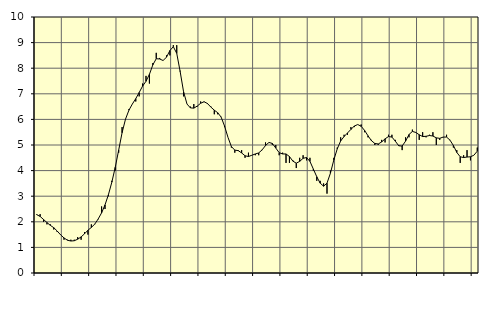
| Category | Piggar | Series 1 |
|---|---|---|
| nan | 2.3 | 2.28 |
| 87.0 | 2.3 | 2.21 |
| 87.0 | 2 | 2.09 |
| 87.0 | 1.9 | 1.97 |
| nan | 1.9 | 1.86 |
| 88.0 | 1.7 | 1.77 |
| 88.0 | 1.6 | 1.64 |
| 88.0 | 1.5 | 1.49 |
| nan | 1.3 | 1.37 |
| 89.0 | 1.3 | 1.28 |
| 89.0 | 1.3 | 1.25 |
| 89.0 | 1.3 | 1.26 |
| nan | 1.4 | 1.32 |
| 90.0 | 1.3 | 1.41 |
| 90.0 | 1.6 | 1.53 |
| 90.0 | 1.5 | 1.67 |
| nan | 1.9 | 1.78 |
| 91.0 | 1.9 | 1.91 |
| 91.0 | 2.1 | 2.11 |
| 91.0 | 2.6 | 2.35 |
| nan | 2.5 | 2.66 |
| 92.0 | 3 | 3.06 |
| 92.0 | 3.6 | 3.55 |
| 92.0 | 4 | 4.13 |
| nan | 4.7 | 4.8 |
| 93.0 | 5.7 | 5.48 |
| 93.0 | 6 | 6.01 |
| 93.0 | 6.4 | 6.36 |
| nan | 6.6 | 6.6 |
| 94.0 | 6.7 | 6.81 |
| 94.0 | 6.9 | 7.05 |
| 94.0 | 7.4 | 7.3 |
| nan | 7.7 | 7.49 |
| 95.0 | 7.4 | 7.76 |
| 95.0 | 8.2 | 8.13 |
| 95.0 | 8.6 | 8.37 |
| nan | 8.4 | 8.36 |
| 96.0 | 8.3 | 8.3 |
| 96.0 | 8.5 | 8.43 |
| 96.0 | 8.5 | 8.69 |
| nan | 8.9 | 8.84 |
| 97.0 | 8.9 | 8.58 |
| 97.0 | 7.9 | 7.87 |
| 97.0 | 6.9 | 7.08 |
| nan | 6.6 | 6.6 |
| 98.0 | 6.5 | 6.45 |
| 98.0 | 6.6 | 6.44 |
| 98.0 | 6.5 | 6.52 |
| nan | 6.7 | 6.63 |
| 99.0 | 6.7 | 6.69 |
| 99.0 | 6.6 | 6.62 |
| 99.0 | 6.5 | 6.48 |
| nan | 6.2 | 6.36 |
| 0.0 | 6.2 | 6.26 |
| 0.0 | 6.1 | 6.09 |
| 0.0 | 5.7 | 5.74 |
| nan | 5.3 | 5.3 |
| 1.0 | 4.9 | 4.94 |
| 1.0 | 4.7 | 4.8 |
| 1.0 | 4.8 | 4.78 |
| nan | 4.8 | 4.69 |
| 2.0 | 4.5 | 4.58 |
| 2.0 | 4.7 | 4.55 |
| 2.0 | 4.6 | 4.6 |
| nan | 4.6 | 4.65 |
| 3.0 | 4.6 | 4.69 |
| 3.0 | 4.8 | 4.81 |
| 3.0 | 5.1 | 4.98 |
| nan | 5.1 | 5.1 |
| 4.0 | 5 | 5.06 |
| 4.0 | 5 | 4.88 |
| 4.0 | 4.6 | 4.7 |
| nan | 4.7 | 4.65 |
| 5.0 | 4.3 | 4.65 |
| 5.0 | 4.3 | 4.55 |
| 5.0 | 4.4 | 4.37 |
| nan | 4.1 | 4.29 |
| 6.0 | 4.5 | 4.36 |
| 6.0 | 4.6 | 4.48 |
| 6.0 | 4.4 | 4.51 |
| nan | 4.5 | 4.36 |
| 7.0 | 4 | 4.06 |
| 7.0 | 3.6 | 3.76 |
| 7.0 | 3.6 | 3.51 |
| nan | 3.5 | 3.39 |
| 8.0 | 3.1 | 3.51 |
| 8.0 | 4 | 3.9 |
| 8.0 | 4.5 | 4.42 |
| nan | 4.9 | 4.85 |
| 9.0 | 5.3 | 5.16 |
| 9.0 | 5.4 | 5.33 |
| 9.0 | 5.4 | 5.47 |
| nan | 5.7 | 5.61 |
| 10.0 | 5.7 | 5.74 |
| 10.0 | 5.8 | 5.8 |
| 10.0 | 5.8 | 5.73 |
| nan | 5.5 | 5.57 |
| 11.0 | 5.3 | 5.36 |
| 11.0 | 5.2 | 5.17 |
| 11.0 | 5 | 5.06 |
| nan | 5 | 5.04 |
| 12.0 | 5.2 | 5.12 |
| 12.0 | 5.1 | 5.24 |
| 12.0 | 5.4 | 5.33 |
| nan | 5.4 | 5.31 |
| 13.0 | 5.2 | 5.15 |
| 13.0 | 5 | 4.97 |
| 13.0 | 4.8 | 4.96 |
| nan | 5.3 | 5.15 |
| 14.0 | 5.3 | 5.41 |
| 14.0 | 5.6 | 5.53 |
| 14.0 | 5.5 | 5.49 |
| nan | 5.2 | 5.4 |
| 15.0 | 5.5 | 5.33 |
| 15.0 | 5.3 | 5.34 |
| 15.0 | 5.4 | 5.37 |
| nan | 5.5 | 5.35 |
| 16.0 | 5 | 5.28 |
| 16.0 | 5.2 | 5.26 |
| 16.0 | 5.3 | 5.31 |
| nan | 5.4 | 5.31 |
| 17.0 | 5.2 | 5.19 |
| 17.0 | 4.9 | 4.98 |
| 17.0 | 4.8 | 4.71 |
| nan | 4.3 | 4.54 |
| 18.0 | 4.6 | 4.51 |
| 18.0 | 4.8 | 4.53 |
| 18.0 | 4.4 | 4.54 |
| nan | 4.6 | 4.6 |
| 19.0 | 4.9 | 4.76 |